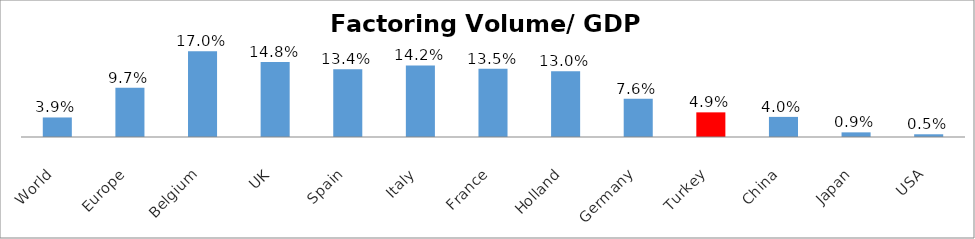
| Category | Factoring Volume/ GDP (%) |
|---|---|
| World | 0.039 |
| Europe | 0.097 |
| Belgium | 0.17 |
| UK | 0.148 |
| Spain | 0.134 |
| Italy | 0.142 |
| France | 0.135 |
| Holland | 0.13 |
| Germany | 0.076 |
| Turkey | 0.049 |
| China | 0.04 |
| Japan | 0.009 |
| USA | 0.005 |